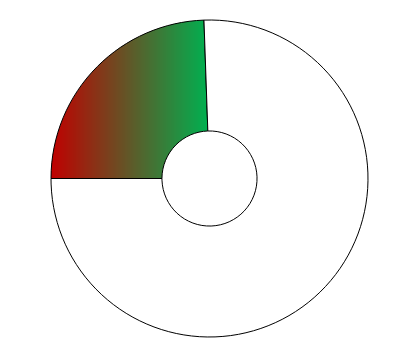
| Category | Series 0 |
|---|---|
| 0 | 88 |
| 1 | 272 |